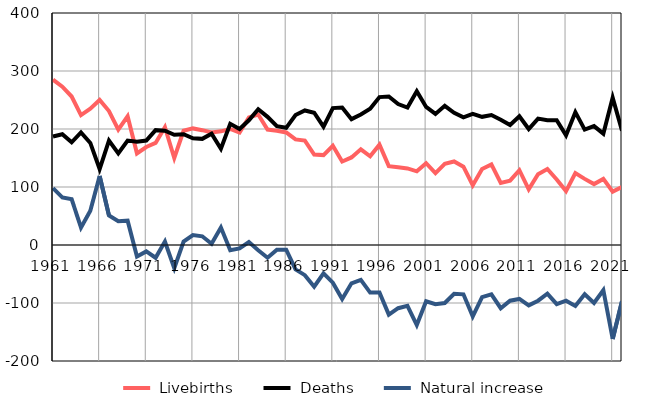
| Category |  Livebirths |  Deaths |  Natural increase |
|---|---|---|---|
| 1961.0 | 285 | 187 | 98 |
| 1962.0 | 273 | 191 | 82 |
| 1963.0 | 256 | 177 | 79 |
| 1964.0 | 224 | 194 | 30 |
| 1965.0 | 235 | 176 | 59 |
| 1966.0 | 250 | 131 | 119 |
| 1967.0 | 231 | 180 | 51 |
| 1968.0 | 199 | 158 | 41 |
| 1969.0 | 222 | 180 | 42 |
| 1970.0 | 158 | 178 | -20 |
| 1971.0 | 169 | 180 | -11 |
| 1972.0 | 176 | 198 | -22 |
| 1973.0 | 203 | 197 | 6 |
| 1974.0 | 150 | 190 | -40 |
| 1975.0 | 197 | 191 | 6 |
| 1976.0 | 201 | 184 | 17 |
| 1977.0 | 198 | 183 | 15 |
| 1978.0 | 194 | 192 | 2 |
| 1979.0 | 196 | 166 | 30 |
| 1980.0 | 200 | 209 | -9 |
| 1981.0 | 194 | 200 | -6 |
| 1982.0 | 220 | 215 | 5 |
| 1983.0 | 225 | 234 | -9 |
| 1984.0 | 199 | 221 | -22 |
| 1985.0 | 197 | 205 | -8 |
| 1986.0 | 194 | 202 | -8 |
| 1987.0 | 182 | 224 | -42 |
| 1988.0 | 180 | 232 | -52 |
| 1989.0 | 156 | 228 | -72 |
| 1990.0 | 155 | 204 | -49 |
| 1991.0 | 171 | 236 | -65 |
| 1992.0 | 144 | 237 | -93 |
| 1993.0 | 151 | 217 | -66 |
| 1994.0 | 165 | 225 | -60 |
| 1995.0 | 153 | 235 | -82 |
| 1996.0 | 173 | 255 | -82 |
| 1997.0 | 136 | 256 | -120 |
| 1998.0 | 134 | 243 | -109 |
| 1999.0 | 132 | 237 | -105 |
| 2000.0 | 127 | 265 | -138 |
| 2001.0 | 141 | 238 | -97 |
| 2002.0 | 124 | 226 | -102 |
| 2003.0 | 140 | 240 | -100 |
| 2004.0 | 144 | 228 | -84 |
| 2005.0 | 135 | 220 | -85 |
| 2006.0 | 103 | 226 | -123 |
| 2007.0 | 131 | 221 | -90 |
| 2008.0 | 139 | 224 | -85 |
| 2009.0 | 107 | 216 | -109 |
| 2010.0 | 111 | 207 | -96 |
| 2011.0 | 129 | 222 | -93 |
| 2012.0 | 96 | 200 | -104 |
| 2013.0 | 122 | 218 | -96 |
| 2014.0 | 131 | 215 | -84 |
| 2015.0 | 113 | 215 | -102 |
| 2016.0 | 93 | 189 | -96 |
| 2017.0 | 124 | 229 | -105 |
| 2018.0 | 114 | 199 | -85 |
| 2019.0 | 105 | 205 | -100 |
| 2020.0 | 114 | 192 | -78 |
| 2021.0 | 92 | 254 | -162 |
| 2022.0 | 100 | 197 | -97 |